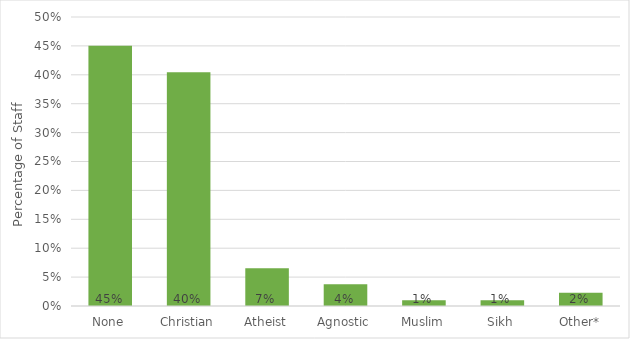
| Category | % of Staff |
|---|---|
| None | 0.45 |
| Christian | 0.404 |
| Atheist | 0.065 |
| Agnostic | 0.038 |
| Muslim | 0.01 |
| Sikh | 0.01 |
| Other* | 0.023 |